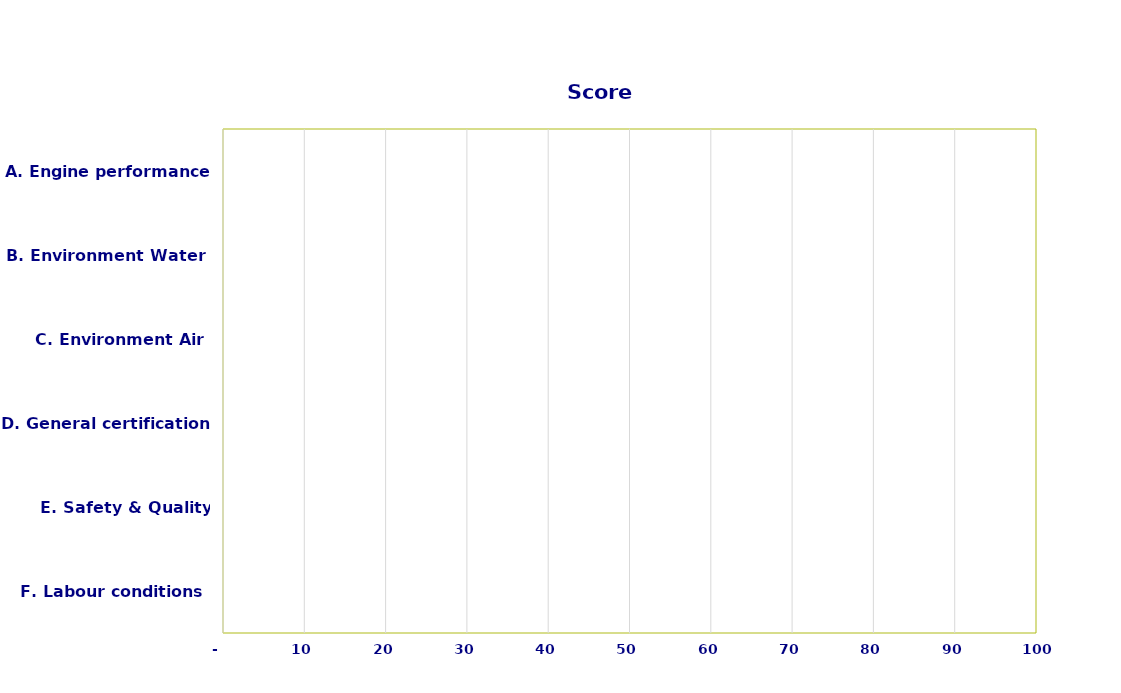
| Category | Score |
|---|---|
| F. Labour conditions | 0 |
| E. Safety & Quality (S&Q) | 0 |
| D. General certification | 0 |
| C. Environment Air | 0 |
| B. Environment Water | 0 |
| A. Engine performance | 0 |